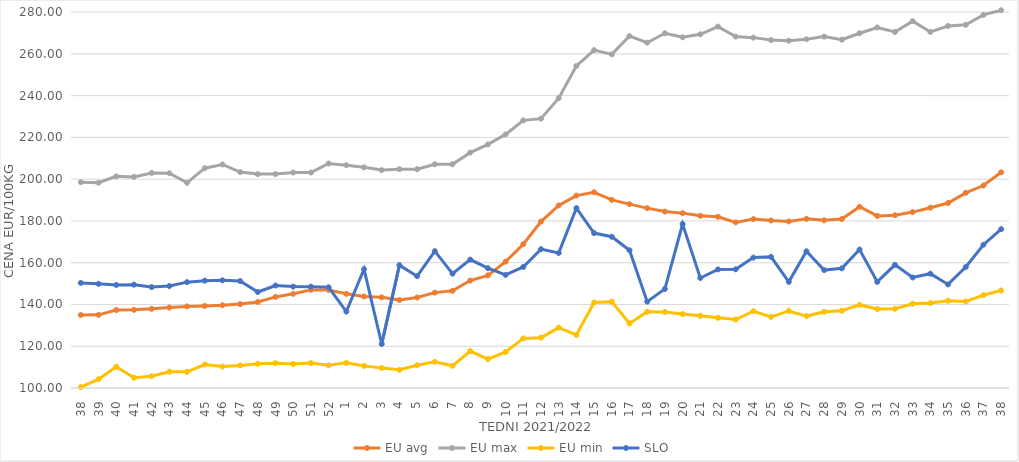
| Category | EU avg | EU max | EU min | SLO |
|---|---|---|---|---|
| 38.0 | 134.959 | 198.57 | 100.43 | 150.32 |
| 39.0 | 135.021 | 198.3 | 104.21 | 149.86 |
| 40.0 | 137.315 | 201.34 | 110.15 | 149.34 |
| 41.0 | 137.411 | 201.081 | 104.9 | 149.48 |
| 42.0 | 137.908 | 202.98 | 105.65 | 148.32 |
| 43.0 | 138.52 | 202.856 | 107.8 | 148.83 |
| 44.0 | 139.076 | 198.26 | 107.75 | 150.69 |
| 45.0 | 139.275 | 205.257 | 111.25 | 151.41 |
| 46.0 | 139.626 | 207.046 | 110.26 | 151.56 |
| 47.0 | 140.17 | 203.387 | 110.83 | 151.2 |
| 48.0 | 141.2 | 202.42 | 111.62 | 145.97 |
| 49.0 | 143.614 | 202.45 | 111.89 | 149.07 |
| 50.0 | 145.101 | 203.17 | 111.54 | 148.55 |
| 51.0 | 146.984 | 203.17 | 111.93 | 148.54 |
| 52.0 | 146.958 | 207.5 | 110.85 | 148.22 |
| 1.0 | 145.11 | 206.66 | 112.04 | 136.59 |
| 2.0 | 143.822 | 205.67 | 110.59 | 156.88 |
| 3.0 | 143.402 | 204.34 | 109.62 | 121.07 |
| 4.0 | 142.134 | 204.76 | 108.71 | 158.82 |
| 5.0 | 143.314 | 204.76 | 110.86 | 153.55 |
| 6.0 | 145.677 | 207.14 | 112.52 | 165.51 |
| 7.0 | 146.556 | 207.14 | 110.619 | 154.74 |
| 8.0 | 151.439 | 212.7 | 117.709 | 161.48 |
| 9.0 | 153.947 | 216.67 | 113.871 | 157.38 |
| 10.0 | 160.496 | 221.43 | 117.233 | 154.16 |
| 11.0 | 168.845 | 228.17 | 123.737 | 157.96 |
| 12.0 | 179.714 | 228.97 | 124.105 | 166.49 |
| 13.0 | 187.409 | 238.81 | 128.918 | 164.66 |
| 14.0 | 192.137 | 254.21 | 125.399 | 186.11 |
| 15.0 | 193.697 | 261.79 | 140.954 | 174.18 |
| 16.0 | 190.066 | 259.76 | 141.337 | 172.42 |
| 17.0 | 188.031 | 268.52 | 130.897 | 165.96 |
| 18.0 | 186.119 | 265.34 | 136.529 | 141.36 |
| 19.0 | 184.47 | 269.87 | 136.387 | 147.43 |
| 20.0 | 183.734 | 267.92 | 135.392 | 178.51 |
| 21.0 | 182.45 | 269.38 | 134.589 | 152.67 |
| 22.0 | 181.991 | 273.06 | 133.621 | 156.8 |
| 23.0 | 179.308 | 268.27 | 132.787 | 156.84 |
| 24.0 | 180.886 | 267.77 | 136.75 | 162.44 |
| 25.0 | 180.2 | 266.63 | 134.058 | 162.78 |
| 26.0 | 179.77 | 266.27 | 136.895 | 150.82 |
| 27.0 | 180.992 | 267.02 | 134.44 | 165.45 |
| 28.0 | 180.305 | 268.25 | 136.486 | 156.46 |
| 29.0 | 180.913 | 266.77 | 136.97 | 157.31 |
| 30.0 | 186.794 | 269.87 | 139.777 | 166.29 |
| 31.0 | 182.385 | 272.64 | 137.828 | 150.81 |
| 32.0 | 182.73 | 270.47 | 137.934 | 158.99 |
| 33.0 | 184.227 | 275.68 | 140.33 | 152.91 |
| 34.0 | 186.348 | 270.49 | 140.7 | 154.73 |
| 35.0 | 188.567 | 273.33 | 141.78 | 149.6 |
| 36.0 | 193.455 | 273.91 | 141.41 | 157.93 |
| 37.0 | 196.95 | 278.68 | 144.47 | 168.61 |
| 38.0 | 203.287 | 280.88 | 146.68 | 176.07 |